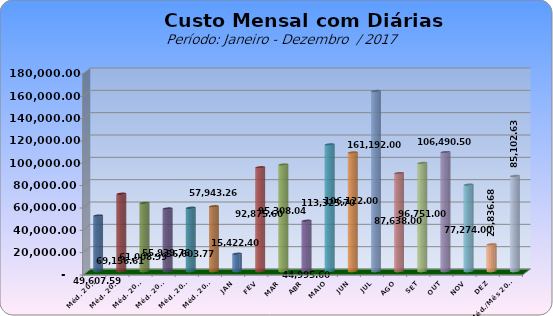
| Category | Series 0 |
|---|---|
| Méd. 2011 | 49607.59 |
| Méd. 2012 | 69156.61 |
| Méd. 2013 | 61008.99 |
| Méd. 2014 | 55939.76 |
| Méd. 2015 | 56603.77 |
| Méd. 2016 | 57943.26 |
| JAN | 15422.4 |
| FEV | 92875.6 |
| MAR | 95308.04 |
| ABR | 44995.6 |
| MAIO | 113325.7 |
| JUN | 106122 |
| JUL | 161192 |
| AGO | 87638 |
| SET | 96751 |
| OUT | 106490.5 |
| NOV | 77274 |
| DEZ | 23836.68 |
| Méd./Mês 2016 | 85102.627 |